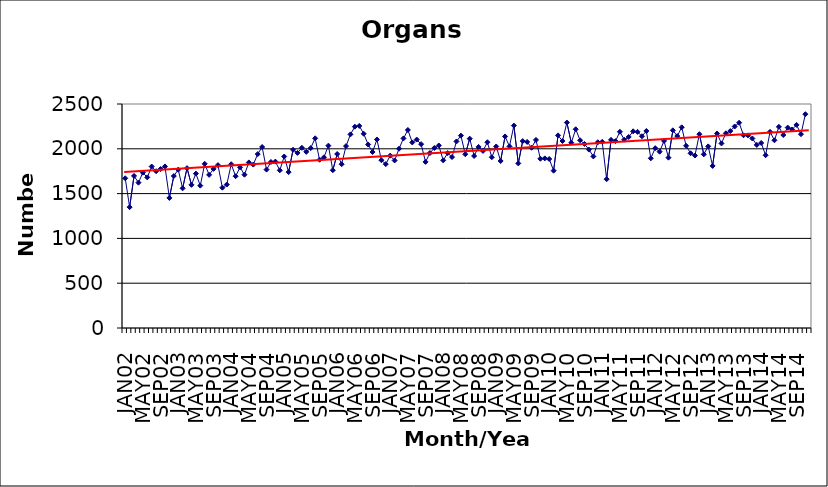
| Category | Series 0 |
|---|---|
| JAN02 | 1671 |
| FEB02 | 1349 |
| MAR02 | 1697 |
| APR02 | 1622 |
| MAY02 | 1734 |
| JUN02 | 1681 |
| JUL02 | 1802 |
| AUG02 | 1750 |
| SEP02 | 1774 |
| OCT02 | 1803 |
| NOV02 | 1452 |
| DEC02 | 1696 |
| JAN03 | 1767 |
| FEB03 | 1559 |
| MAR03 | 1784 |
| APR03 | 1598 |
| MAY03 | 1723 |
| JUN03 | 1589 |
| JUL03 | 1832 |
| AUG03 | 1709 |
| SEP03 | 1776 |
| OCT03 | 1818 |
| NOV03 | 1566 |
| DEC03 | 1601 |
| JAN04 | 1828 |
| FEB04 | 1694 |
| MAR04 | 1793 |
| APR04 | 1711 |
| MAY04 | 1848 |
| JUN04 | 1824 |
| JUL04 | 1941 |
| AUG04 | 2020 |
| SEP04 | 1768 |
| OCT04 | 1853 |
| NOV04 | 1857 |
| DEC04 | 1760 |
| JAN05 | 1914 |
| FEB05 | 1740 |
| MAR05 | 1989 |
| APR05 | 1954 |
| MAY05 | 2011 |
| JUN05 | 1966 |
| JUL05 | 2008 |
| AUG05 | 2117 |
| SEP05 | 1878 |
| OCT05 | 1905 |
| NOV05 | 2035 |
| DEC05 | 1761 |
| JAN06 | 1942 |
| FEB06 | 1828 |
| MAR06 | 2030 |
| APR06 | 2161 |
| MAY06 | 2247 |
| JUN06 | 2255 |
| JUL06 | 2168 |
| AUG06 | 2048 |
| SEP06 | 1964 |
| OCT06 | 2104 |
| NOV06 | 1873 |
| DEC06 | 1829 |
| JAN07 | 1924 |
| FEB07 | 1870 |
| MAR07 | 2001 |
| APR07 | 2116 |
| MAY07 | 2210 |
| JUN07 | 2071 |
| JUL07 | 2103 |
| AUG07 | 2052 |
| SEP07 | 1854 |
| OCT07 | 1953 |
| NOV07 | 2009 |
| DEC07 | 2037 |
| JAN08 | 1871 |
| FEB08 | 1952 |
| MAR08 | 1908 |
| APR08 | 2082 |
| MAY08 | 2147 |
| JUN08 | 1939 |
| JUL08 | 2113 |
| AUG08 | 1920 |
| SEP08 | 2021 |
| OCT08 | 1976 |
| NOV08 | 2073 |
| DEC08 | 1906 |
| JAN09 | 2026 |
| FEB09 | 1864 |
| MAR09 | 2138 |
| APR09 | 2027 |
| MAY09 | 2259 |
| JUN09 | 1837 |
| JUL09 | 2086 |
| AUG09 | 2077 |
| SEP09 | 2012 |
| OCT09 | 2099 |
| NOV09 | 1889 |
| DEC09 | 1893 |
| JAN10 | 1886 |
| FEB10 | 1756 |
| MAR10 | 2150 |
| APR10 | 2087 |
| MAY10 | 2293 |
| JUN10 | 2068 |
| JUL10 | 2218 |
| AUG10 | 2095 |
| SEP10 | 2054 |
| OCT10 | 1991 |
| NOV10 | 1915 |
| DEC10 | 2073 |
| JAN11 | 2078 |
| FEB11 | 1661 |
| MAR11 | 2100 |
| APR11 | 2086 |
| MAY11 | 2190 |
| JUN11 | 2102 |
| JUL11 | 2132 |
| AUG11 | 2195 |
| SEP11 | 2189 |
| OCT11 | 2140 |
| NOV11 | 2199 |
| DEC11 | 1894 |
| JAN12 | 2007 |
| FEB12 | 1968 |
| MAR12 | 2088 |
| APR12 | 1901 |
| MAY12 | 2206 |
| JUN12 | 2142 |
| JUL12 | 2240 |
| AUG12 | 2033 |
| SEP12 | 1950 |
| OCT12 | 1925 |
| NOV12 | 2163 |
| DEC12 | 1938 |
| JAN13 | 2027 |
| FEB13 | 1809 |
| MAR13 | 2171 |
| APR13 | 2060 |
| MAY13 | 2173 |
| JUN13 | 2198 |
| JUL13 | 2249 |
| AUG13 | 2291 |
| SEP13 | 2151 |
| OCT13 | 2150 |
| NOV13 | 2115 |
| DEC13 | 2043 |
| JAN14 | 2065 |
| FEB14 | 1928 |
| MAR14 | 2189 |
| APR14 | 2095 |
| MAY14 | 2245 |
| JUN14 | 2154 |
| JUL14 | 2237 |
| AUG14 | 2216 |
| SEP14 | 2267 |
| OCT14 | 2163 |
| NOV14 | 2386 |